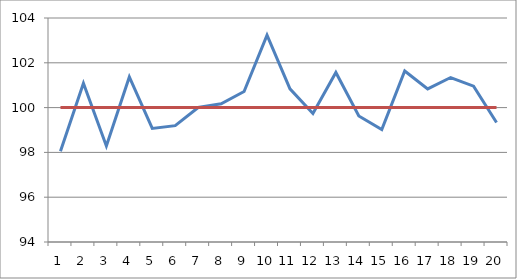
| Category | Series 0 | Series 1 |
|---|---|---|
| 0 | 98.047 | 100 |
| 1 | 101.086 | 100 |
| 2 | 98.284 | 100 |
| 3 | 101.367 | 100 |
| 4 | 99.072 | 100 |
| 5 | 99.194 | 100 |
| 6 | 100.005 | 100 |
| 7 | 100.169 | 100 |
| 8 | 100.718 | 100 |
| 9 | 103.236 | 100 |
| 10 | 100.837 | 100 |
| 11 | 99.739 | 100 |
| 12 | 101.568 | 100 |
| 13 | 99.624 | 100 |
| 14 | 99.021 | 100 |
| 15 | 101.632 | 100 |
| 16 | 100.833 | 100 |
| 17 | 101.343 | 100 |
| 18 | 100.956 | 100 |
| 19 | 99.337 | 100 |